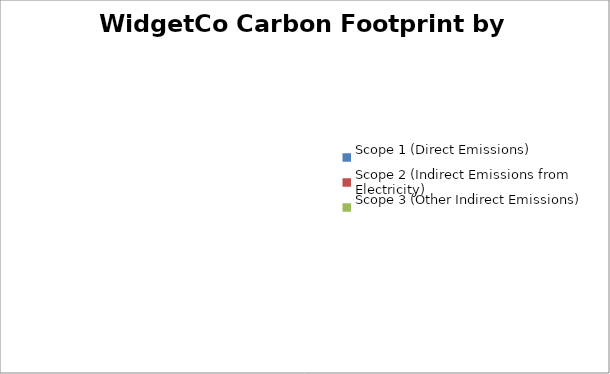
| Category | GHG Emissions _x000d_(tons CO2-eq) |
|---|---|
| Scope 1 (Direct Emissions) | 0 |
| Scope 2 (Indirect Emissions from Electricity) | 0 |
| Scope 3 (Other Indirect Emissions) | 0 |